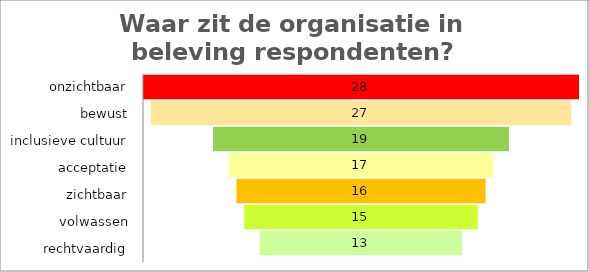
| Category | Series 0 |
|---|---|
| diversiteitsbeleid | 1 |
| organisatiecultuur | 3 |
| werving & selectie | 2 |
| toegankelijkheid en aanpassingen | 2 |
| loopbaanontwikkeling | 1 |
| kwaliteit van functioneren & verzuimbeleid | 3 |